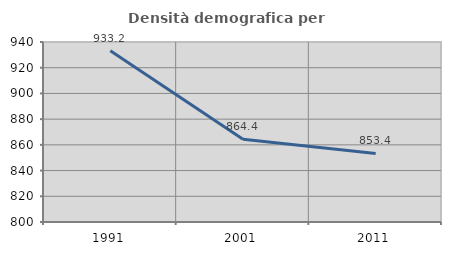
| Category | Densità demografica |
|---|---|
| 1991.0 | 933.156 |
| 2001.0 | 864.378 |
| 2011.0 | 853.351 |